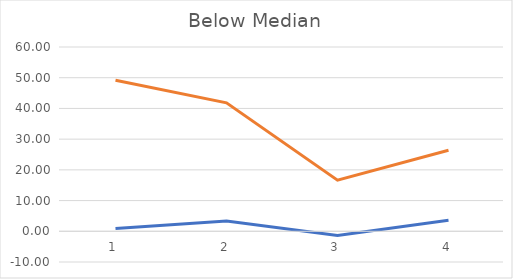
| Category | Series 0 | Series 1 |
|---|---|---|
| 0 | 0.888 | 49.178 |
| 1 | 3.346 | 41.834 |
| 2 | -1.336 | 16.634 |
| 3 | 3.567 | 26.366 |